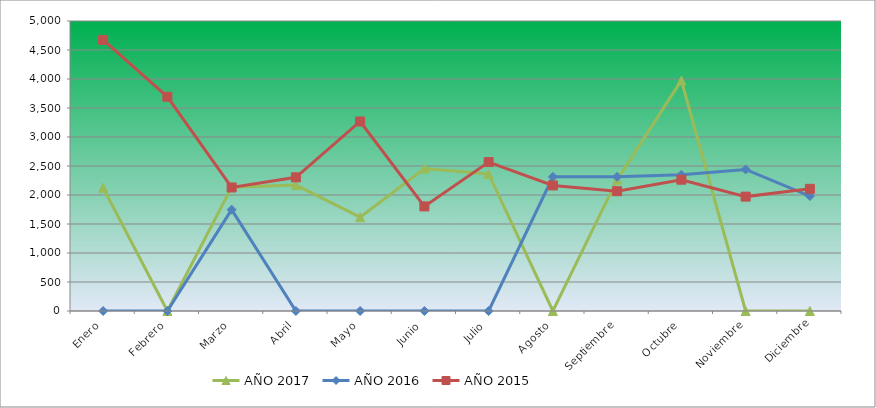
| Category | AÑO 2017 | AÑO 2016 | AÑO 2015 |
|---|---|---|---|
| Enero | 2124.043 | 0 | 4673.822 |
| Febrero | 0 | 0 | 3693.545 |
| Marzo | 2135.681 | 1747.612 | 2129.769 |
| Abril | 2170.597 | 0 | 2304.818 |
| Mayo | 1617.764 | 0 | 3267.591 |
| Junio | 2455.743 | 0 | 1803.01 |
| Julio | 2362.634 | 0 | 2567.393 |
| Agosto | 0 | 2312.673 | 2164.779 |
| Septiembre | 2263.706 | 2312.673 | 2065.584 |
| Octubre | 3974.579 | 2347.625 | 2263.974 |
| Noviembre | 0 | 2440.831 | 1972.224 |
| Diciembre | 0 | 1980.627 | 2106.429 |